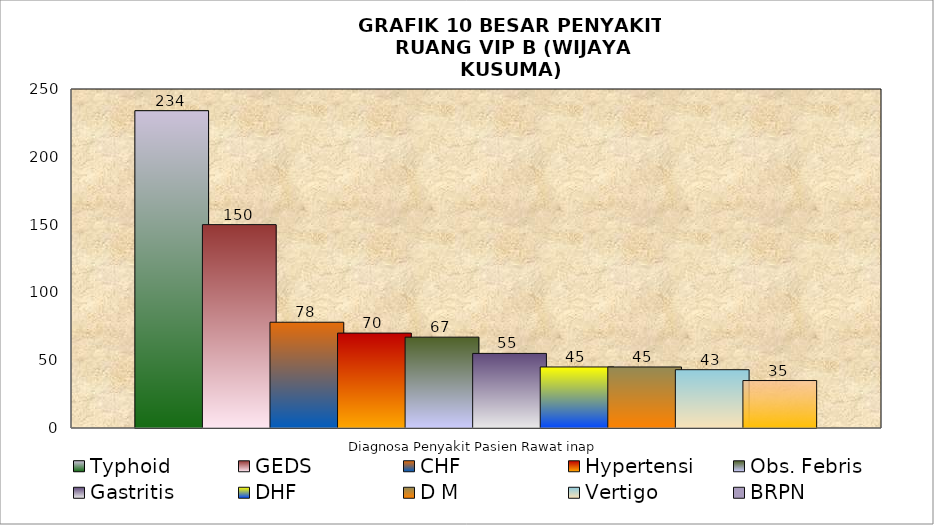
| Category | Typhoid | GEDS | CHF | Hypertensi | Obs. Febris | Gastritis | DHF | D M | Vertigo | BRPN |
|---|---|---|---|---|---|---|---|---|---|---|
| 0 | 234 | 150 | 78 | 70 | 67 | 55 | 45 | 45 | 43 | 35 |